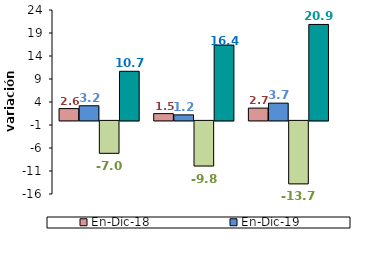
| Category | En-Dic-18 | En-Dic-19 | En-Dic-20p | En-Dic-21pr |
|---|---|---|---|---|
| 0 | 2.564 | 3.187 | -7.048 | 10.677 |
| 1 | 1.475 | 1.204 | -9.805 | 16.376 |
| 2 | 2.673 | 3.749 | -13.689 | 20.86 |